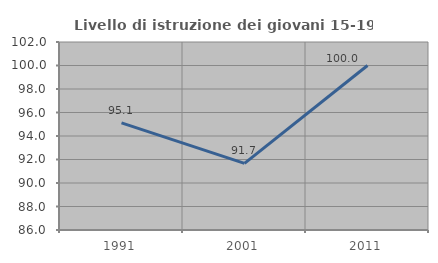
| Category | Livello di istruzione dei giovani 15-19 anni |
|---|---|
| 1991.0 | 95.122 |
| 2001.0 | 91.667 |
| 2011.0 | 100 |